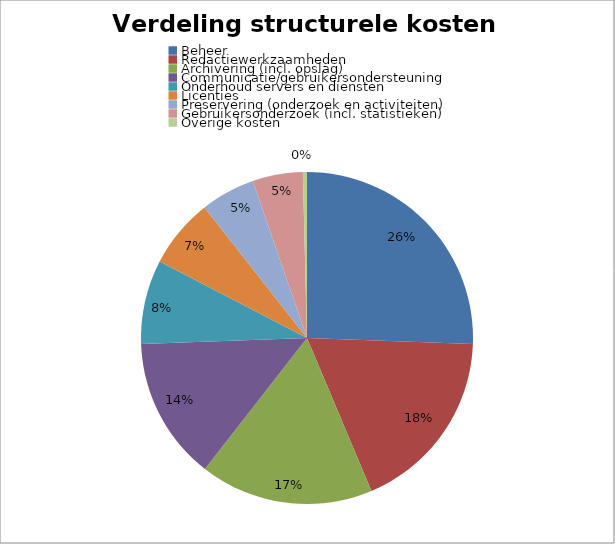
| Category | Series 0 |
|---|---|
| Beheer | 25.6 |
| Redactiewerkzaamheden | 18.1 |
| Archivering (incl. opslag) | 16.9 |
| Communicatie/gebruikersondersteuning | 13.9 |
| Onderhoud servers en diensten | 8.2 |
| Licenties | 6.8 |
| Preservering (onderzoek en activiteiten) | 5.3 |
| Gebruikersonderzoek (incl. statistieken) | 4.9 |
| Overige kosten | 0.4 |